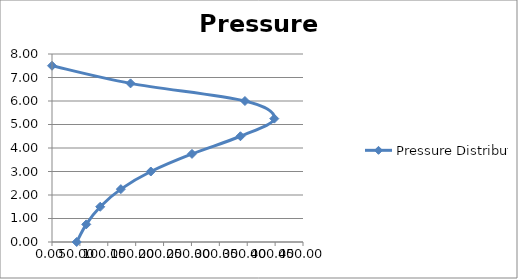
| Category | Pressure Distribution |
|---|---|
| 0.0 | 7.5 |
| 140.8327114005925 | 6.75 |
| 345.9555555555556 | 6 |
| 398.5408 | 5.25 |
| 337.8472222222221 | 4.5 |
| 250.97978522914318 | 3.75 |
| 177.15065999089666 | 3 |
| 123.45432660698935 | 2.25 |
| 86.48888888888888 | 1.5 |
| 61.407316749810704 | 0.75 |
| 44.32781627418555 | 0 |